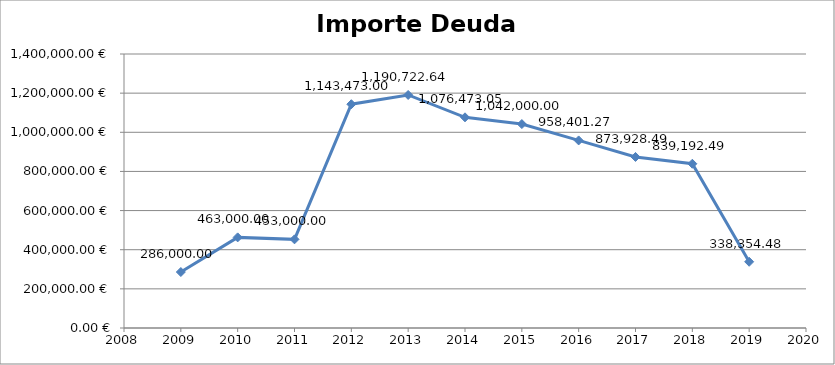
| Category | Importe deuda viva  |
|---|---|
| 2009.0 | 286000 |
| 2010.0 | 463000 |
| 2011.0 | 453000 |
| 2012.0 | 1143473 |
| 2013.0 | 1190722.64 |
| 2014.0 | 1076473.05 |
| 2015.0 | 1042000 |
| 2016.0 | 958401.27 |
| 2017.0 | 873928.49 |
| 2018.0 | 839192.49 |
| 2019.0 | 338354.48 |